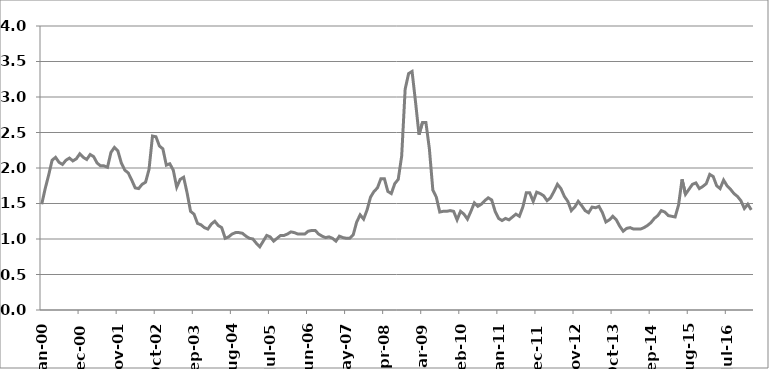
| Category | Series 1 |
|---|---|
| 2000-01-01 | 1.49 |
| 2000-02-01 | 1.71 |
| 2000-03-01 | 1.9 |
| 2000-04-01 | 2.11 |
| 2000-05-01 | 2.15 |
| 2000-06-01 | 2.08 |
| 2000-07-01 | 2.05 |
| 2000-08-01 | 2.11 |
| 2000-09-01 | 2.14 |
| 2000-10-01 | 2.1 |
| 2000-11-01 | 2.13 |
| 2000-12-01 | 2.2 |
| 2001-01-01 | 2.15 |
| 2001-02-01 | 2.12 |
| 2001-03-01 | 2.19 |
| 2001-04-01 | 2.16 |
| 2001-05-01 | 2.07 |
| 2001-06-01 | 2.03 |
| 2001-07-01 | 2.03 |
| 2001-08-01 | 2.01 |
| 2001-09-01 | 2.22 |
| 2001-10-01 | 2.29 |
| 2001-11-01 | 2.24 |
| 2001-12-01 | 2.07 |
| 2002-01-01 | 1.97 |
| 2002-02-01 | 1.93 |
| 2002-03-01 | 1.83 |
| 2002-04-01 | 1.72 |
| 2002-05-01 | 1.71 |
| 2002-06-01 | 1.77 |
| 2002-07-01 | 1.8 |
| 2002-08-01 | 1.98 |
| 2002-09-01 | 2.45 |
| 2002-10-01 | 2.44 |
| 2002-11-01 | 2.31 |
| 2002-12-01 | 2.27 |
| 2003-01-01 | 2.04 |
| 2003-02-01 | 2.06 |
| 2003-03-01 | 1.97 |
| 2003-04-01 | 1.73 |
| 2003-05-01 | 1.84 |
| 2003-06-01 | 1.87 |
| 2003-07-01 | 1.65 |
| 2003-08-01 | 1.39 |
| 2003-09-01 | 1.35 |
| 2003-10-01 | 1.22 |
| 2003-11-01 | 1.2 |
| 2003-12-01 | 1.16 |
| 2004-01-01 | 1.14 |
| 2004-02-01 | 1.21 |
| 2004-03-01 | 1.25 |
| 2004-04-01 | 1.19 |
| 2004-05-01 | 1.16 |
| 2004-06-01 | 1.01 |
| 2004-07-01 | 1.03 |
| 2004-08-01 | 1.07 |
| 2004-09-01 | 1.09 |
| 2004-10-01 | 1.09 |
| 2004-11-01 | 1.08 |
| 2004-12-01 | 1.04 |
| 2005-01-01 | 1.01 |
| 2005-02-01 | 1 |
| 2005-03-01 | 0.94 |
| 2005-04-01 | 0.89 |
| 2005-05-01 | 0.97 |
| 2005-06-01 | 1.05 |
| 2005-07-01 | 1.03 |
| 2005-08-01 | 0.97 |
| 2005-09-01 | 1.01 |
| 2005-10-01 | 1.05 |
| 2005-11-01 | 1.05 |
| 2005-12-01 | 1.07 |
| 2006-01-01 | 1.1 |
| 2006-02-01 | 1.09 |
| 2006-03-01 | 1.07 |
| 2006-04-01 | 1.07 |
| 2006-05-01 | 1.07 |
| 2006-06-01 | 1.11 |
| 2006-07-01 | 1.12 |
| 2006-08-01 | 1.12 |
| 2006-09-01 | 1.07 |
| 2006-10-01 | 1.04 |
| 2006-11-01 | 1.02 |
| 2006-12-01 | 1.03 |
| 2007-01-01 | 1.01 |
| 2007-02-01 | 0.97 |
| 2007-03-01 | 1.04 |
| 2007-04-01 | 1.02 |
| 2007-05-01 | 1.01 |
| 2007-06-01 | 1.01 |
| 2007-07-01 | 1.06 |
| 2007-08-01 | 1.24 |
| 2007-09-01 | 1.34 |
| 2007-10-01 | 1.28 |
| 2007-11-01 | 1.41 |
| 2007-12-01 | 1.59 |
| 2008-01-01 | 1.67 |
| 2008-02-01 | 1.72 |
| 2008-03-01 | 1.85 |
| 2008-04-01 | 1.85 |
| 2008-05-01 | 1.67 |
| 2008-06-01 | 1.64 |
| 2008-07-01 | 1.78 |
| 2008-08-01 | 1.84 |
| 2008-09-01 | 2.17 |
| 2008-10-01 | 3.11 |
| 2008-11-01 | 3.33 |
| 2008-12-01 | 3.36 |
| 2009-01-01 | 2.93 |
| 2009-02-01 | 2.47 |
| 2009-03-01 | 2.64 |
| 2009-04-01 | 2.64 |
| 2009-05-01 | 2.27 |
| 2009-06-01 | 1.69 |
| 2009-07-01 | 1.59 |
| 2009-08-01 | 1.38 |
| 2009-09-01 | 1.39 |
| 2009-10-01 | 1.39 |
| 2009-11-01 | 1.4 |
| 2009-12-01 | 1.39 |
| 2010-01-01 | 1.27 |
| 2010-02-01 | 1.39 |
| 2010-03-01 | 1.35 |
| 2010-04-01 | 1.28 |
| 2010-05-01 | 1.39 |
| 2010-06-01 | 1.51 |
| 2010-07-01 | 1.46 |
| 2010-08-01 | 1.49 |
| 2010-09-01 | 1.54 |
| 2010-10-01 | 1.58 |
| 2010-11-01 | 1.55 |
| 2010-12-01 | 1.39 |
| 2011-01-01 | 1.29 |
| 2011-02-01 | 1.26 |
| 2011-03-01 | 1.29 |
| 2011-04-01 | 1.27 |
| 2011-05-01 | 1.31 |
| 2011-06-01 | 1.35 |
| 2011-07-01 | 1.32 |
| 2011-08-01 | 1.45 |
| 2011-09-01 | 1.65 |
| 2011-10-01 | 1.65 |
| 2011-11-01 | 1.53 |
| 2011-12-01 | 1.66 |
| 2012-01-01 | 1.64 |
| 2012-02-01 | 1.61 |
| 2012-03-01 | 1.54 |
| 2012-04-01 | 1.58 |
| 2012-05-01 | 1.67 |
| 2012-06-01 | 1.77 |
| 2012-07-01 | 1.71 |
| 2012-08-01 | 1.6 |
| 2012-09-01 | 1.53 |
| 2012-10-01 | 1.4 |
| 2012-11-01 | 1.45 |
| 2012-12-01 | 1.53 |
| 2013-01-01 | 1.47 |
| 2013-02-01 | 1.4 |
| 2013-03-01 | 1.37 |
| 2013-04-01 | 1.45 |
| 2013-05-01 | 1.44 |
| 2013-06-01 | 1.46 |
| 2013-07-01 | 1.37 |
| 2013-08-01 | 1.24 |
| 2013-09-01 | 1.27 |
| 2013-10-01 | 1.32 |
| 2013-11-01 | 1.27 |
| 2013-12-01 | 1.18 |
| 2014-01-01 | 1.11 |
| 2014-02-01 | 1.15 |
| 2014-03-01 | 1.16 |
| 2014-04-01 | 1.14 |
| 2014-05-01 | 1.14 |
| 2014-06-01 | 1.14 |
| 2014-07-01 | 1.16 |
| 2014-08-01 | 1.19 |
| 2014-09-01 | 1.23 |
| 2014-10-01 | 1.29 |
| 2014-11-01 | 1.33 |
| 2014-12-01 | 1.4 |
| 2015-01-01 | 1.38 |
| 2015-02-01 | 1.33 |
| 2015-03-01 | 1.32 |
| 2015-04-01 | 1.31 |
| 2015-05-01 | 1.48 |
| 2015-06-01 | 1.84 |
| 2015-07-01 | 1.63 |
| 2015-08-01 | 1.7 |
| 2015-09-01 | 1.77 |
| 2015-10-01 | 1.79 |
| 2015-11-01 | 1.71 |
| 2015-12-01 | 1.74 |
| 2016-01-01 | 1.78 |
| 2016-02-01 | 1.91 |
| 2016-03-01 | 1.88 |
| 2016-04-01 | 1.75 |
| 2016-05-01 | 1.71 |
| 2016-06-01 | 1.83 |
| 2016-07-01 | 1.75 |
| 2016-08-01 | 1.7 |
| 2016-09-01 | 1.64 |
| 2016-10-01 | 1.6 |
| 2016-11-01 | 1.54 |
| 2016-12-01 | 1.43 |
| 2017-01-01 | 1.49 |
| 2017-02-01 | 1.41 |